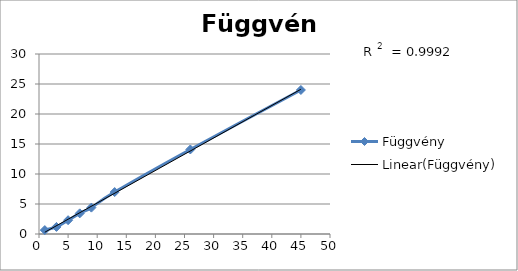
| Category | Függvény |
|---|---|
| 1.0 | 0.652 |
| 3.0 | 1.178 |
| 5.0 | 2.301 |
| 7.0 | 3.441 |
| 9.0 | 4.397 |
| 13.0 | 6.987 |
| 26.0 | 14.086 |
| 45.0 | 24.005 |